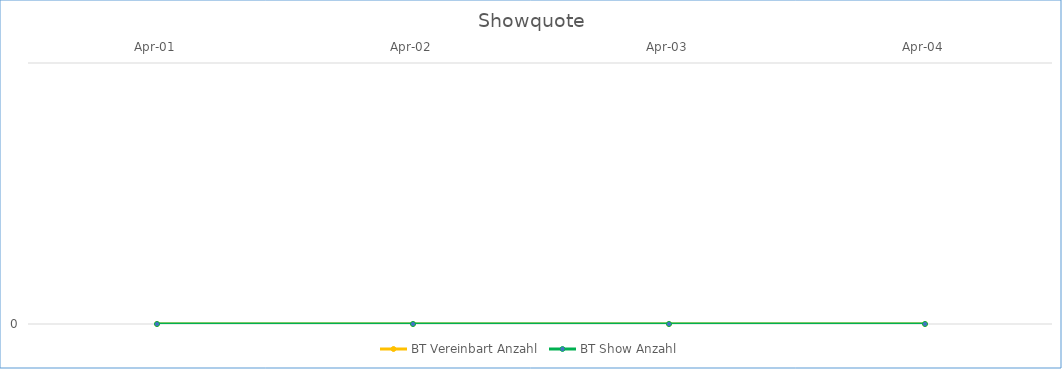
| Category | BT Vereinbart Anzahl | BT Show Anzahl |
|---|---|---|
| 2001-04-01 | 0 | 0 |
| 2002-04-01 | 0 | 0 |
| 2003-04-01 | 0 | 0 |
| 2004-04-01 | 0 | 0 |